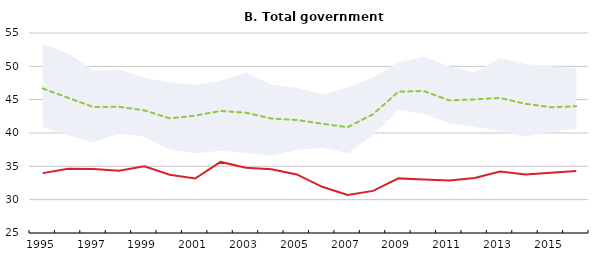
| Category | Switzerland | OECD |
|---|---|---|
| 1995.0 | 33.98 | 46.685 |
| 1996.0 | 34.645 | 45.282 |
| 1997.0 | 34.588 | 43.886 |
| 1998.0 | 34.334 | 43.938 |
| 1999.0 | 34.996 | 43.399 |
| 2000.0 | 33.729 | 42.196 |
| 2001.0 | 33.169 | 42.604 |
| 2002.0 | 35.664 | 43.311 |
| 2003.0 | 34.793 | 43.042 |
| 2004.0 | 34.55 | 42.17 |
| 2005.0 | 33.785 | 41.955 |
| 2006.0 | 31.932 | 41.392 |
| 2007.0 | 30.709 | 40.871 |
| 2008.0 | 31.317 | 42.819 |
| 2009.0 | 33.193 | 46.201 |
| 2010.0 | 33.014 | 46.301 |
| 2011.0 | 32.894 | 44.889 |
| 2012.0 | 33.239 | 45.041 |
| 2013.0 | 34.218 | 45.256 |
| 2014.0 | 33.771 | 44.377 |
| 2015.0 | 34.042 | 43.864 |
| 2016.0 | 34.317 | 44.01 |